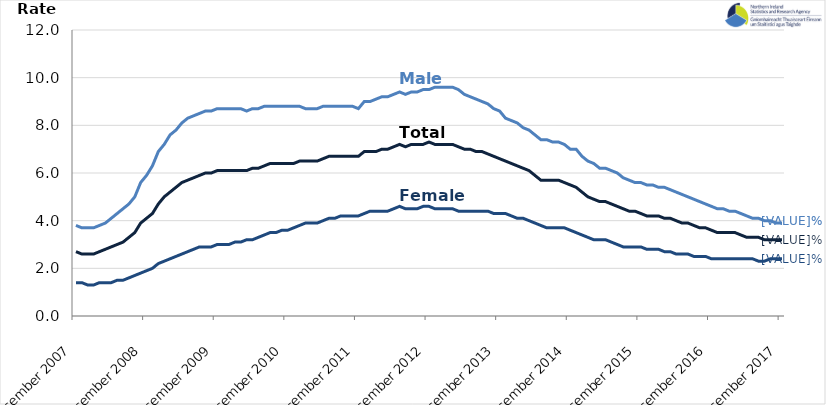
| Category | Male | Female | Total |
|---|---|---|---|
| 2007-12-01 | 3.8 | 1.4 | 2.7 |
| 2008-01-01 | 3.7 | 1.4 | 2.6 |
| 2008-02-01 | 3.7 | 1.3 | 2.6 |
| 2008-03-01 | 3.7 | 1.3 | 2.6 |
| 2008-04-01 | 3.8 | 1.4 | 2.7 |
| 2008-05-01 | 3.9 | 1.4 | 2.8 |
| 2008-06-01 | 4.1 | 1.4 | 2.9 |
| 2008-07-01 | 4.3 | 1.5 | 3 |
| 2008-08-01 | 4.5 | 1.5 | 3.1 |
| 2008-09-01 | 4.7 | 1.6 | 3.3 |
| 2008-10-01 | 5 | 1.7 | 3.5 |
| 2008-11-01 | 5.6 | 1.8 | 3.9 |
| 2008-12-01 | 5.9 | 1.9 | 4.1 |
| 2009-01-01 | 6.3 | 2 | 4.3 |
| 2009-02-01 | 6.9 | 2.2 | 4.7 |
| 2009-03-01 | 7.2 | 2.3 | 5 |
| 2009-04-01 | 7.6 | 2.4 | 5.2 |
| 2009-05-01 | 7.8 | 2.5 | 5.4 |
| 2009-06-01 | 8.1 | 2.6 | 5.6 |
| 2009-07-01 | 8.3 | 2.7 | 5.7 |
| 2009-08-01 | 8.4 | 2.8 | 5.8 |
| 2009-09-01 | 8.5 | 2.9 | 5.9 |
| 2009-10-01 | 8.6 | 2.9 | 6 |
| 2009-11-01 | 8.6 | 2.9 | 6 |
| 2009-12-01 | 8.7 | 3 | 6.1 |
| 2010-01-01 | 8.7 | 3 | 6.1 |
| 2010-02-01 | 8.7 | 3 | 6.1 |
| 2010-03-01 | 8.7 | 3.1 | 6.1 |
| 2010-04-01 | 8.7 | 3.1 | 6.1 |
| 2010-05-01 | 8.6 | 3.2 | 6.1 |
| 2010-06-01 | 8.7 | 3.2 | 6.2 |
| 2010-07-01 | 8.7 | 3.3 | 6.2 |
| 2010-08-01 | 8.8 | 3.4 | 6.3 |
| 2010-09-01 | 8.8 | 3.5 | 6.4 |
| 2010-10-01 | 8.8 | 3.5 | 6.4 |
| 2010-11-01 | 8.8 | 3.6 | 6.4 |
| 2010-12-01 | 8.8 | 3.6 | 6.4 |
| 2011-01-01 | 8.8 | 3.7 | 6.4 |
| 2011-02-01 | 8.8 | 3.8 | 6.5 |
| 2011-03-01 | 8.7 | 3.9 | 6.5 |
| 2011-04-01 | 8.7 | 3.9 | 6.5 |
| 2011-05-01 | 8.7 | 3.9 | 6.5 |
| 2011-06-01 | 8.8 | 4 | 6.6 |
| 2011-07-01 | 8.8 | 4.1 | 6.7 |
| 2011-08-01 | 8.8 | 4.1 | 6.7 |
| 2011-09-01 | 8.8 | 4.2 | 6.7 |
| 2011-10-01 | 8.8 | 4.2 | 6.7 |
| 2011-11-01 | 8.8 | 4.2 | 6.7 |
| 2011-12-01 | 8.7 | 4.2 | 6.7 |
| 2012-01-01 | 9 | 4.3 | 6.9 |
| 2012-02-01 | 9 | 4.4 | 6.9 |
| 2012-03-01 | 9.1 | 4.4 | 6.9 |
| 2012-04-01 | 9.2 | 4.4 | 7 |
| 2012-05-01 | 9.2 | 4.4 | 7 |
| 2012-06-01 | 9.3 | 4.5 | 7.1 |
| 2012-07-01 | 9.4 | 4.6 | 7.2 |
| 2012-08-01 | 9.3 | 4.5 | 7.1 |
| 2012-09-01 | 9.4 | 4.5 | 7.2 |
| 2012-10-01 | 9.4 | 4.5 | 7.2 |
| 2012-11-01 | 9.5 | 4.6 | 7.2 |
| 2012-12-01 | 9.5 | 4.6 | 7.3 |
| 2013-01-01 | 9.6 | 4.5 | 7.2 |
| 2013-02-01 | 9.6 | 4.5 | 7.2 |
| 2013-03-01 | 9.6 | 4.5 | 7.2 |
| 2013-04-01 | 9.6 | 4.5 | 7.2 |
| 2013-05-01 | 9.5 | 4.4 | 7.1 |
| 2013-06-01 | 9.3 | 4.4 | 7 |
| 2013-07-01 | 9.2 | 4.4 | 7 |
| 2013-08-01 | 9.1 | 4.4 | 6.9 |
| 2013-09-01 | 9 | 4.4 | 6.9 |
| 2013-10-01 | 8.9 | 4.4 | 6.8 |
| 2013-11-01 | 8.7 | 4.3 | 6.7 |
| 2013-12-01 | 8.6 | 4.3 | 6.6 |
| 2014-01-01 | 8.3 | 4.3 | 6.5 |
| 2014-02-01 | 8.2 | 4.2 | 6.4 |
| 2014-03-01 | 8.1 | 4.1 | 6.3 |
| 2014-04-01 | 7.9 | 4.1 | 6.2 |
| 2014-05-01 | 7.8 | 4 | 6.1 |
| 2014-06-01 | 7.6 | 3.9 | 5.9 |
| 2014-07-01 | 7.4 | 3.8 | 5.7 |
| 2014-08-01 | 7.4 | 3.7 | 5.7 |
| 2014-09-01 | 7.3 | 3.7 | 5.7 |
| 2014-10-01 | 7.3 | 3.7 | 5.7 |
| 2014-11-01 | 7.2 | 3.7 | 5.6 |
| 2014-12-01 | 7 | 3.6 | 5.5 |
| 2015-01-01 | 7 | 3.5 | 5.4 |
| 2015-02-01 | 6.7 | 3.4 | 5.2 |
| 2015-03-01 | 6.5 | 3.3 | 5 |
| 2015-04-01 | 6.4 | 3.2 | 4.9 |
| 2015-05-01 | 6.2 | 3.2 | 4.8 |
| 2015-06-01 | 6.2 | 3.2 | 4.8 |
| 2015-07-01 | 6.1 | 3.1 | 4.7 |
| 2015-08-01 | 6 | 3 | 4.6 |
| 2015-09-01 | 5.8 | 2.9 | 4.5 |
| 2015-10-01 | 5.7 | 2.9 | 4.4 |
| 2015-11-01 | 5.6 | 2.9 | 4.4 |
| 2015-12-01 | 5.6 | 2.9 | 4.3 |
| 2016-01-01 | 5.5 | 2.8 | 4.2 |
| 2016-02-01 | 5.5 | 2.8 | 4.2 |
| 2016-03-01 | 5.4 | 2.8 | 4.2 |
| 2016-04-01 | 5.4 | 2.7 | 4.1 |
| 2016-05-01 | 5.3 | 2.7 | 4.1 |
| 2016-06-01 | 5.2 | 2.6 | 4 |
| 2016-07-01 | 5.1 | 2.6 | 3.9 |
| 2016-08-01 | 5 | 2.6 | 3.9 |
| 2016-09-01 | 4.9 | 2.5 | 3.8 |
| 2016-10-01 | 4.8 | 2.5 | 3.7 |
| 2016-11-01 | 4.7 | 2.5 | 3.7 |
| 2016-12-01 | 4.6 | 2.4 | 3.6 |
| 2017-01-01 | 4.5 | 2.4 | 3.5 |
| 2017-02-01 | 4.5 | 2.4 | 3.5 |
| 2017-03-01 | 4.4 | 2.4 | 3.5 |
| 2017-04-01 | 4.4 | 2.4 | 3.5 |
| 2017-05-01 | 4.3 | 2.4 | 3.4 |
| 2017-06-01 | 4.2 | 2.4 | 3.3 |
| 2017-07-01 | 4.1 | 2.4 | 3.3 |
| 2017-08-01 | 4.1 | 2.3 | 3.3 |
| 2017-09-01 | 4 | 2.3 | 3.2 |
| 2017-10-01 | 4 | 2.4 | 3.2 |
| 2017-11-01 | 3.9 | 2.4 | 3.2 |
| 2017-12-01 | 3.9 | 2.4 | 3.2 |